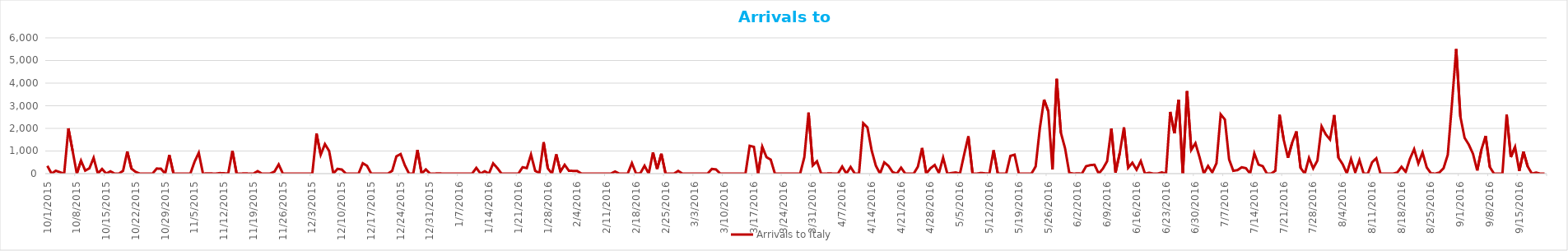
| Category | Arrivals to Italy |
|---|---|
| 10/1/15 | 343 |
| 10/2/15 | 0 |
| 10/3/15 | 128 |
| 10/4/15 | 62 |
| 10/5/15 | 0 |
| 10/6/15 | 2001 |
| 10/7/15 | 1010 |
| 10/8/15 | 0 |
| 10/9/15 | 572 |
| 10/10/15 | 134 |
| 10/11/15 | 237 |
| 10/12/15 | 698 |
| 10/13/15 | 0 |
| 10/14/15 | 207 |
| 10/15/15 | 0 |
| 10/16/15 | 102 |
| 10/17/15 | 0 |
| 10/18/15 | 0 |
| 10/19/15 | 125 |
| 10/20/15 | 979 |
| 10/21/15 | 219 |
| 10/22/15 | 76 |
| 10/23/15 | 0 |
| 10/24/15 | 0 |
| 10/25/15 | 0 |
| 10/26/15 | 0 |
| 10/27/15 | 224 |
| 10/28/15 | 218 |
| 10/29/15 | 0 |
| 10/30/15 | 823 |
| 10/31/15 | 0 |
| 11/1/15 | 0 |
| 11/2/15 | 0 |
| 11/3/15 | 0 |
| 11/4/15 | 0 |
| 11/5/15 | 526 |
| 11/6/15 | 920 |
| 11/7/15 | 0 |
| 11/8/15 | 9 |
| 11/9/15 | 6 |
| 11/10/15 | 0 |
| 11/11/15 | 24 |
| 11/12/15 | 16 |
| 11/13/15 | 2 |
| 11/14/15 | 1014 |
| 11/15/15 | 0 |
| 11/16/15 | 0 |
| 11/17/15 | 13 |
| 11/18/15 | 0 |
| 11/19/15 | 0 |
| 11/20/15 | 111 |
| 11/21/15 | 0 |
| 11/22/15 | 0 |
| 11/23/15 | 5 |
| 11/24/15 | 89 |
| 11/25/15 | 406 |
| 11/26/15 | 0 |
| 11/27/15 | 0 |
| 11/28/15 | 0 |
| 11/29/15 | 0 |
| 11/30/15 | 0 |
| 12/1/15 | 0 |
| 12/2/15 | 0 |
| 12/3/15 | 1 |
| 12/4/15 | 1769 |
| 12/5/15 | 837 |
| 12/6/15 | 1304 |
| 12/7/15 | 1003 |
| 12/8/15 | 0 |
| 12/9/15 | 212 |
| 12/10/15 | 181 |
| 12/11/15 | 0 |
| 12/12/15 | 0 |
| 12/13/15 | 0 |
| 12/14/15 | 0 |
| 12/15/15 | 459 |
| 12/16/15 | 348 |
| 12/17/15 | 0 |
| 12/18/15 | 0 |
| 12/19/15 | 0 |
| 12/20/15 | 0 |
| 12/21/15 | 0 |
| 12/22/15 | 128 |
| 12/23/15 | 765 |
| 12/24/15 | 865 |
| 12/25/15 | 371 |
| 12/26/15 | 0 |
| 12/27/15 | 0 |
| 12/28/15 | 1045 |
| 12/29/15 | 0 |
| 12/30/15 | 188 |
| 12/31/15 | 0 |
| 1/1/16 | 0 |
| 1/2/16 | 13 |
| 1/3/16 | 0 |
| 1/4/16 | 0 |
| 1/5/16 | 0 |
| 1/6/16 | 0 |
| 1/7/16 | 0 |
| 1/8/16 | 0 |
| 1/9/16 | 0 |
| 1/10/16 | 0 |
| 1/11/16 | 255 |
| 1/12/16 | 0 |
| 1/13/16 | 105 |
| 1/14/16 | 0 |
| 1/15/16 | 453 |
| 1/16/16 | 245 |
| 1/17/16 | 0 |
| 1/18/16 | 0 |
| 1/19/16 | 0 |
| 1/20/16 | 0 |
| 1/21/16 | 0 |
| 1/22/16 | 282 |
| 1/23/16 | 245 |
| 1/24/16 | 842 |
| 1/25/16 | 124 |
| 1/26/16 | 24 |
| 1/27/16 | 1389 |
| 1/28/16 | 232 |
| 1/29/16 | 0 |
| 1/30/16 | 855 |
| 1/31/16 | 92 |
| 2/1/16 | 389 |
| 2/2/16 | 129 |
| 2/3/16 | 121 |
| 2/4/16 | 117 |
| 2/5/16 | 0 |
| 2/6/16 | 0 |
| 2/7/16 | 0 |
| 2/8/16 | 0 |
| 2/9/16 | 0 |
| 2/10/16 | 0 |
| 2/11/16 | 0 |
| 2/12/16 | 0 |
| 2/13/16 | 93 |
| 2/14/16 | 0 |
| 2/15/16 | 0 |
| 2/16/16 | 0 |
| 2/17/16 | 464 |
| 2/18/16 | 0 |
| 2/19/16 | 17 |
| 2/20/16 | 347 |
| 2/21/16 | 0 |
| 2/22/16 | 938 |
| 2/23/16 | 207 |
| 2/24/16 | 879 |
| 2/25/16 | 0 |
| 2/26/16 | 0 |
| 2/27/16 | 0 |
| 2/28/16 | 120 |
| 2/29/16 | 0 |
| 3/1/16 | 0 |
| 3/2/16 | 0 |
| 3/3/16 | 0 |
| 3/4/16 | 0 |
| 3/5/16 | 0 |
| 3/6/16 | 0 |
| 3/7/16 | 208 |
| 3/8/16 | 187 |
| 3/9/16 | 0 |
| 3/10/16 | 0 |
| 3/11/16 | 0 |
| 3/12/16 | 0 |
| 3/13/16 | 0 |
| 3/14/16 | 0 |
| 3/15/16 | 0 |
| 3/16/16 | 1230 |
| 3/17/16 | 1184 |
| 3/18/16 | 0 |
| 3/19/16 | 1189 |
| 3/20/16 | 727 |
| 3/21/16 | 619 |
| 3/22/16 | 0 |
| 3/23/16 | 0 |
| 3/24/16 | 0 |
| 3/25/16 | 0 |
| 3/26/16 | 0 |
| 3/27/16 | 0 |
| 3/28/16 | 0 |
| 3/29/16 | 730 |
| 3/30/16 | 2699 |
| 3/31/16 | 364 |
| 4/1/16 | 545 |
| 4/2/16 | 0 |
| 4/3/16 | 0 |
| 4/4/16 | 10 |
| 4/5/16 | 0 |
| 4/6/16 | 0 |
| 4/7/16 | 312 |
| 4/8/16 | 0 |
| 4/9/16 | 294 |
| 4/10/16 | 0 |
| 4/11/16 | 0 |
| 4/12/16 | 2231 |
| 4/13/16 | 2044 |
| 4/14/16 | 1030 |
| 4/15/16 | 350 |
| 4/16/16 | 0 |
| 4/17/16 | 497 |
| 4/18/16 | 343 |
| 4/19/16 | 65 |
| 4/20/16 | 0 |
| 4/21/16 | 264 |
| 4/22/16 | 0 |
| 4/23/16 | 0 |
| 4/24/16 | 0 |
| 4/25/16 | 308 |
| 4/26/16 | 1133 |
| 4/27/16 | 0 |
| 4/28/16 | 237 |
| 4/29/16 | 381 |
| 4/30/16 | 27 |
| 5/1/16 | 705 |
| 5/2/16 | 0 |
| 5/3/16 | 27 |
| 5/4/16 | 52 |
| 5/5/16 | 0 |
| 5/6/16 | 847 |
| 5/7/16 | 1651 |
| 5/8/16 | 0 |
| 5/9/16 | 0 |
| 5/10/16 | 32 |
| 5/11/16 | 12 |
| 5/12/16 | 0 |
| 5/13/16 | 1034 |
| 5/14/16 | 0 |
| 5/15/16 | 0 |
| 5/16/16 | 0 |
| 5/17/16 | 784 |
| 5/18/16 | 837 |
| 5/19/16 | 0 |
| 5/20/16 | 0 |
| 5/21/16 | 0 |
| 5/22/16 | 0 |
| 5/23/16 | 315 |
| 5/24/16 | 2006 |
| 5/25/16 | 3268 |
| 5/26/16 | 2760 |
| 5/27/16 | 183 |
| 5/28/16 | 4189 |
| 5/29/16 | 1806 |
| 5/30/16 | 1118 |
| 5/31/16 | 34 |
| 6/1/16 | 0 |
| 6/2/16 | 10 |
| 6/3/16 | 0 |
| 6/4/16 | 328 |
| 6/5/16 | 376 |
| 6/6/16 | 392 |
| 6/7/16 | 0 |
| 6/8/16 | 223 |
| 6/9/16 | 550 |
| 6/10/16 | 1991 |
| 6/11/16 | 47 |
| 6/12/16 | 910 |
| 6/13/16 | 2044 |
| 6/14/16 | 257 |
| 6/15/16 | 482 |
| 6/16/16 | 173 |
| 6/17/16 | 555 |
| 6/18/16 | 0 |
| 6/19/16 | 38 |
| 6/20/16 | 0 |
| 6/21/16 | 0 |
| 6/22/16 | 53 |
| 6/23/16 | 0 |
| 6/24/16 | 2729 |
| 6/25/16 | 1784 |
| 6/26/16 | 3263 |
| 6/27/16 | 0 |
| 6/28/16 | 3645 |
| 6/29/16 | 1050 |
| 6/30/16 | 1344 |
| 7/1/16 | 711 |
| 7/2/16 | 0 |
| 7/3/16 | 338 |
| 7/4/16 | 54 |
| 7/5/16 | 461 |
| 7/6/16 | 2619 |
| 7/7/16 | 2391 |
| 7/8/16 | 630 |
| 7/9/16 | 125 |
| 7/10/16 | 157 |
| 7/11/16 | 281 |
| 7/12/16 | 241 |
| 7/13/16 | 0 |
| 7/14/16 | 896 |
| 7/15/16 | 400 |
| 7/16/16 | 330 |
| 7/17/16 | 0 |
| 7/18/16 | 0 |
| 7/19/16 | 127 |
| 7/20/16 | 2604 |
| 7/21/16 | 1490 |
| 7/22/16 | 701 |
| 7/23/16 | 1369 |
| 7/24/16 | 1866 |
| 7/25/16 | 252 |
| 7/26/16 | 0 |
| 7/27/16 | 694 |
| 7/28/16 | 233 |
| 7/29/16 | 577 |
| 7/30/16 | 2088 |
| 7/31/16 | 1731 |
| 8/1/16 | 1509 |
| 8/2/16 | 2589 |
| 8/3/16 | 706 |
| 8/4/16 | 418 |
| 8/5/16 | 10 |
| 8/6/16 | 643 |
| 8/7/16 | 58 |
| 8/8/16 | 601 |
| 8/9/16 | 0 |
| 8/10/16 | 0 |
| 8/11/16 | 498 |
| 8/12/16 | 679 |
| 8/13/16 | 0 |
| 8/14/16 | 0 |
| 8/15/16 | 0 |
| 8/16/16 | 0 |
| 8/17/16 | 49 |
| 8/18/16 | 303 |
| 8/19/16 | 76 |
| 8/20/16 | 654 |
| 8/21/16 | 1081 |
| 8/22/16 | 449 |
| 8/23/16 | 931 |
| 8/24/16 | 273 |
| 8/25/16 | 13 |
| 8/26/16 | 0 |
| 8/27/16 | 47 |
| 8/28/16 | 240 |
| 8/29/16 | 833 |
| 8/30/16 | 3102 |
| 8/31/16 | 5504 |
| 9/1/16 | 2517 |
| 9/2/16 | 1583 |
| 9/3/16 | 1280 |
| 9/4/16 | 875 |
| 9/5/16 | 140 |
| 9/6/16 | 1060 |
| 9/7/16 | 1662 |
| 9/8/16 | 293 |
| 9/9/16 | 0 |
| 9/10/16 | 0 |
| 9/11/16 | 0 |
| 9/12/16 | 2614 |
| 9/13/16 | 731 |
| 9/14/16 | 1179 |
| 9/15/16 | 121 |
| 9/16/16 | 971 |
| 9/17/16 | 317 |
| 9/18/16 | 0 |
| 9/19/16 | 47 |
| 9/20/16 | 0 |
| 9/21/16 | 0 |